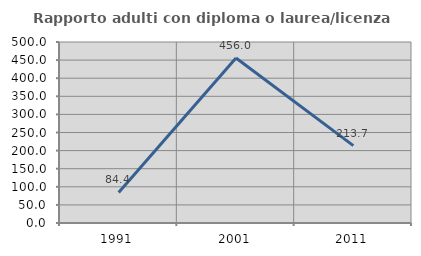
| Category | Rapporto adulti con diploma o laurea/licenza media  |
|---|---|
| 1991.0 | 84.444 |
| 2001.0 | 456 |
| 2011.0 | 213.725 |